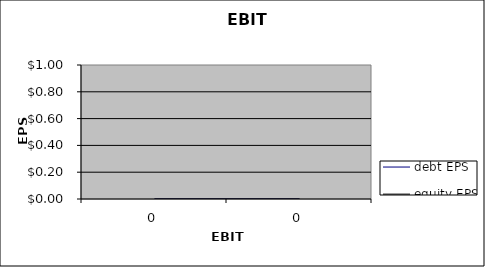
| Category | debt EPS | equity EPS |
|---|---|---|
| 0.0 | 0 | 0 |
| 0.0 | 0 | 0 |